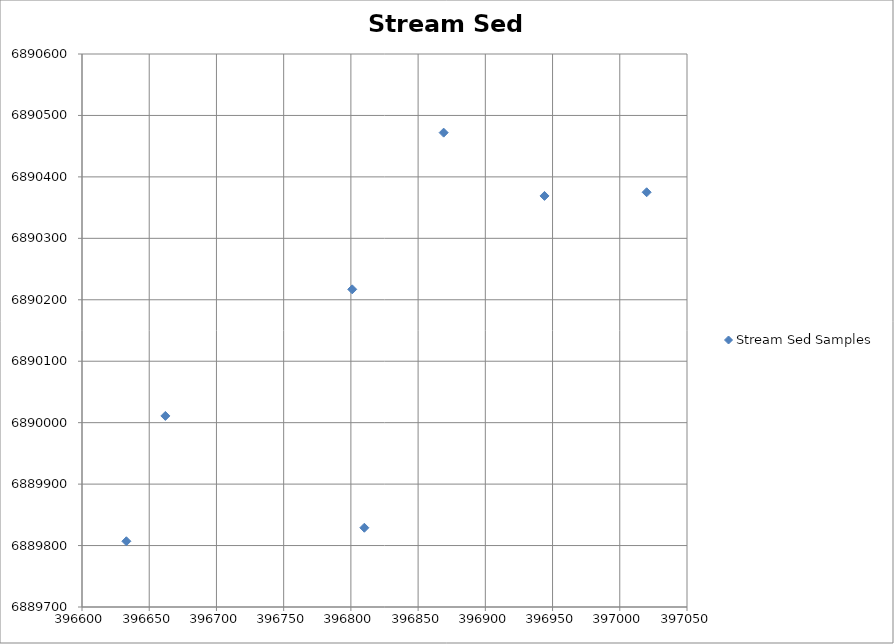
| Category | Stream Sed Samples |
|---|---|
| 396869.0 | 6890472 |
| 396944.0 | 6890369 |
| 396801.0 | 6890217 |
| 396662.0 | 6890011 |
| 396633.0 | 6889807 |
| 396810.0 | 6889829 |
| 397020.0 | 6890375 |